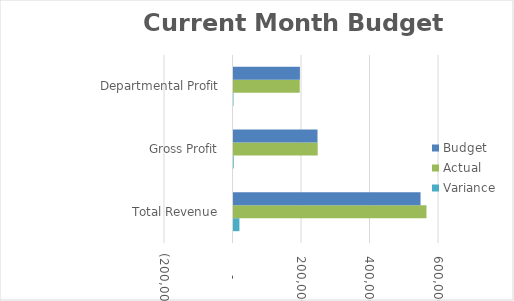
| Category | Variance | Actual | Budget |
|---|---|---|---|
| Total Revenue | 17291.7 | 563408.44 | 546116.74 |
| Gross Profit | 635.35 | 245850.61 | 245215.26 |
| Departmental Profit | -580.66 | 193340.49 | 193921.15 |